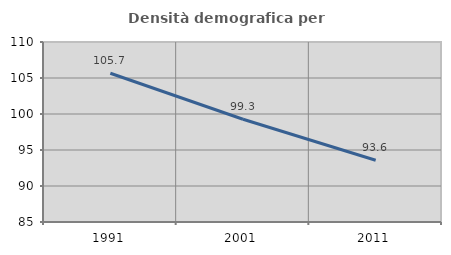
| Category | Densità demografica |
|---|---|
| 1991.0 | 105.659 |
| 2001.0 | 99.271 |
| 2011.0 | 93.576 |